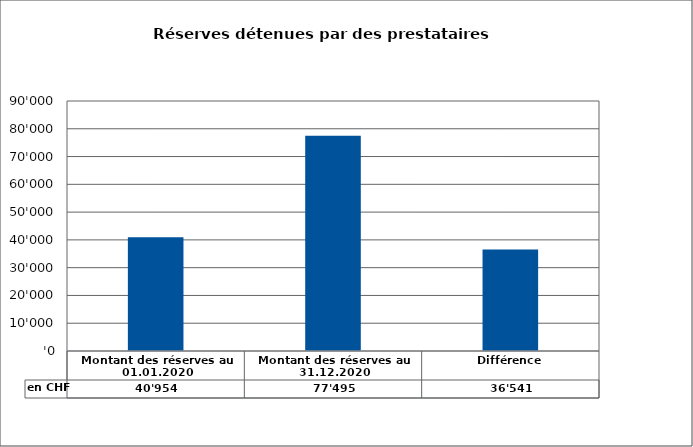
| Category | en CHF |
|---|---|
| Montant des réserves au 01.01.2020 | 40953.86 |
| Montant des réserves au 31.12.2020 | 77495 |
| Différence | 36541.14 |